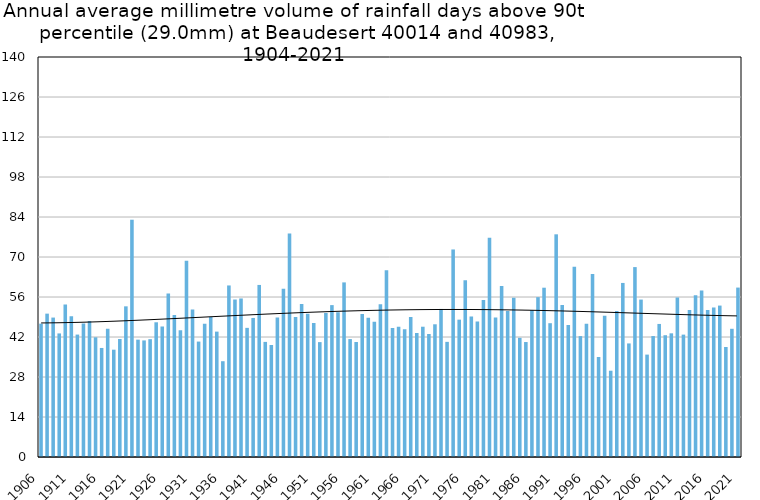
| Category | Annual average mm in days above 90th percentile |
|---|---|
| 1906 | 46.675 |
| 1907 | 50.175 |
| 1908 | 48.8 |
| 1909 | 43.25 |
| 1910 | 53.392 |
| 1911 | 49.283 |
| 1912 | 42.85 |
| 1913 | 46.767 |
| 1914 | 47.6 |
| 1915 | 41.9 |
| 1916 | 38.162 |
| 1917 | 44.875 |
| 1918 | 37.56 |
| 1919 | 41.3 |
| 1920 | 52.733 |
| 1921 | 83.05 |
| 1922 | 41.071 |
| 1923 | 40.8 |
| 1924 | 41.238 |
| 1925 | 47.15 |
| 1926 | 45.64 |
| 1927 | 57.188 |
| 1928 | 49.73 |
| 1929 | 44.356 |
| 1930 | 68.68 |
| 1931 | 51.6 |
| 1932 | 40.4 |
| 1933 | 46.662 |
| 1934 | 48.978 |
| 1935 | 43.886 |
| 1936 | 33.525 |
| 1937 | 60.04 |
| 1938 | 55.12 |
| 1939 | 55.488 |
| 1940 | 45.2 |
| 1941 | 48.667 |
| 1942 | 60.222 |
| 1943 | 40.289 |
| 1944 | 39.2 |
| 1945 | 48.818 |
| 1946 | 58.878 |
| 1947 | 78.211 |
| 1948 | 48.988 |
| 1949 | 53.586 |
| 1950 | 50.144 |
| 1951 | 46.933 |
| 1952 | 40.214 |
| 1953 | 50.414 |
| 1954 | 53.16 |
| 1955 | 50.673 |
| 1956 | 61.112 |
| 1957 | 41.275 |
| 1958 | 40.244 |
| 1959 | 50.044 |
| 1960 | 48.775 |
| 1961 | 47.375 |
| 1962 | 53.475 |
| 1963 | 65.357 |
| 1964 | 45.12 |
| 1965 | 45.611 |
| 1966 | 44.714 |
| 1967 | 49.025 |
| 1968 | 43.4 |
| 1969 | 45.6 |
| 1970 | 43.055 |
| 1971 | 46.45 |
| 1972 | 51.827 |
| 1973 | 40.3 |
| 1974 | 72.636 |
| 1975 | 48.071 |
| 1976 | 61.89 |
| 1977 | 49.143 |
| 1978 | 47.429 |
| 1979 | 54.925 |
| 1980 | 76.733 |
| 1981 | 48.8 |
| 1982 | 59.888 |
| 1983 | 51.073 |
| 1984 | 55.75 |
| 1985 | 41.714 |
| 1986 | 40.24 |
| 1987 | 51.429 |
| 1988 | 55.95 |
| 1989 | 59.255 |
| 1990 | 46.831 |
| 1991 | 77.94 |
| 1992 | 53.222 |
| 1993 | 46.2 |
| 1994 | 66.55 |
| 1995 | 42.309 |
| 1996 | 46.6 |
| 1997 | 64.05 |
| 1998 | 35 |
| 1999 | 49.48 |
| 2000 | 30.2 |
| 2001 | 51.057 |
| 2002 | 60.92 |
| 2003 | 39.75 |
| 2004 | 66.467 |
| 2005 | 55.1 |
| 2006 | 35.84 |
| 2007 | 42.333 |
| 2008 | 46.571 |
| 2009 | 42.625 |
| 2010 | 43.286 |
| 2011 | 55.833 |
| 2012 | 42.833 |
| 2013 | 51.444 |
| 2014 | 56.6 |
| 2015 | 58.25 |
| 2016 | 51.429 |
| 2017 | 52.333 |
| 2018 | 53 |
| 2019 | 38.5 |
| 2020 | 44.875 |
| 2021 | 59.3 |